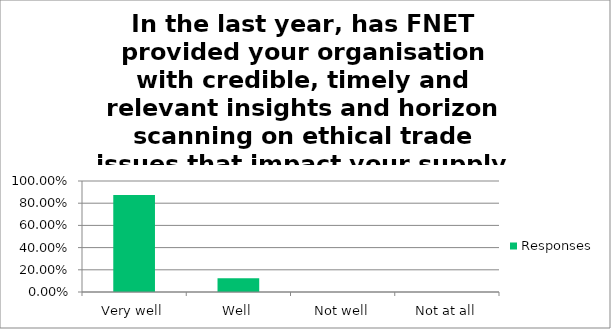
| Category | Responses |
|---|---|
| Very well | 0.875 |
| Well | 0.125 |
| Not well | 0 |
| Not at all | 0 |